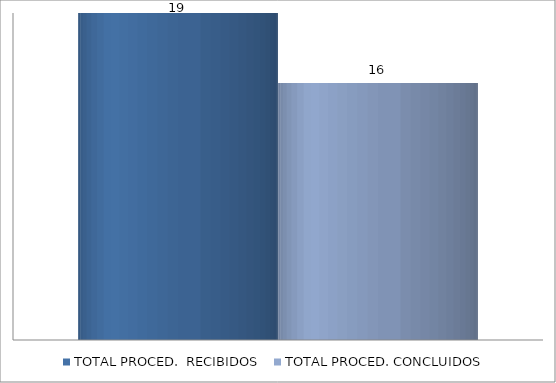
| Category | TOTAL PROCED.  RECIBIDOS | TOTAL PROCED. CONCLUIDOS |
|---|---|---|
| 0 | 19 | 16 |